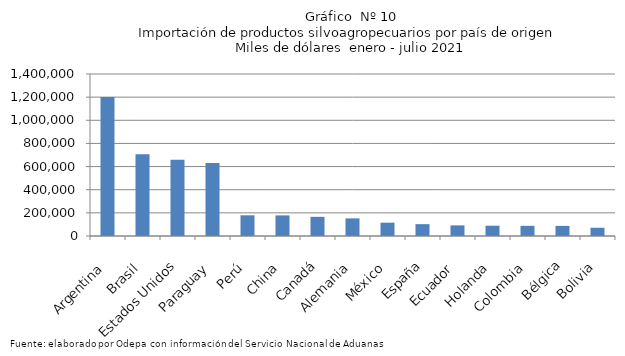
| Category | Series 0 |
|---|---|
| Argentina | 1202025.864 |
| Brasil | 705666.3 |
| Estados Unidos | 658691.373 |
| Paraguay | 630610.577 |
| Perú | 178950.282 |
| China | 178084.482 |
| Canadá | 165617.564 |
| Alemania | 152175.404 |
| México | 115002.664 |
| España | 102412.684 |
| Ecuador | 91795.986 |
| Holanda | 89069.6 |
| Colombia | 87870.12 |
| Bélgica | 87248.023 |
| Bolivia | 71281.702 |